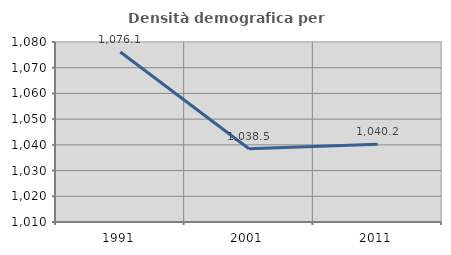
| Category | Densità demografica |
|---|---|
| 1991.0 | 1076.135 |
| 2001.0 | 1038.486 |
| 2011.0 | 1040.214 |